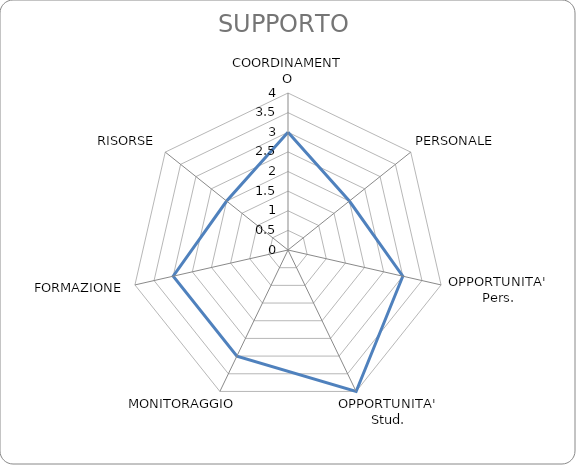
| Category | Series 0 |
|---|---|
| COORDINAMENTO | 3 |
| PERSONALE | 2 |
| OPPORTUNITA' Pers. | 3 |
| OPPORTUNITA' Stud. | 4 |
| MONITORAGGIO | 3 |
| FORMAZIONE | 3 |
| RISORSE | 2 |